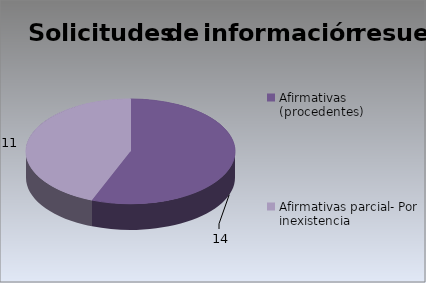
| Category | Series 0 |
|---|---|
| Afirmativas (procedentes) | 14 |
| Afirmativas parcial- Por inexistencia                                                                          | 11 |